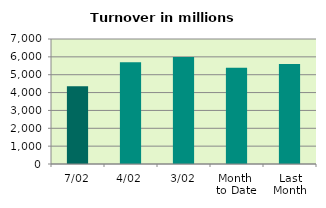
| Category | Series 0 |
|---|---|
| 7/02 | 4351.908 |
| 4/02 | 5701.913 |
| 3/02 | 5985.9 |
| Month 
to Date | 5389.465 |
| Last
Month | 5596.977 |